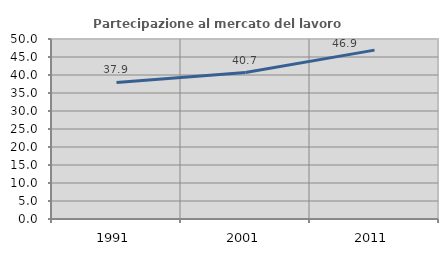
| Category | Partecipazione al mercato del lavoro  femminile |
|---|---|
| 1991.0 | 37.921 |
| 2001.0 | 40.693 |
| 2011.0 | 46.908 |